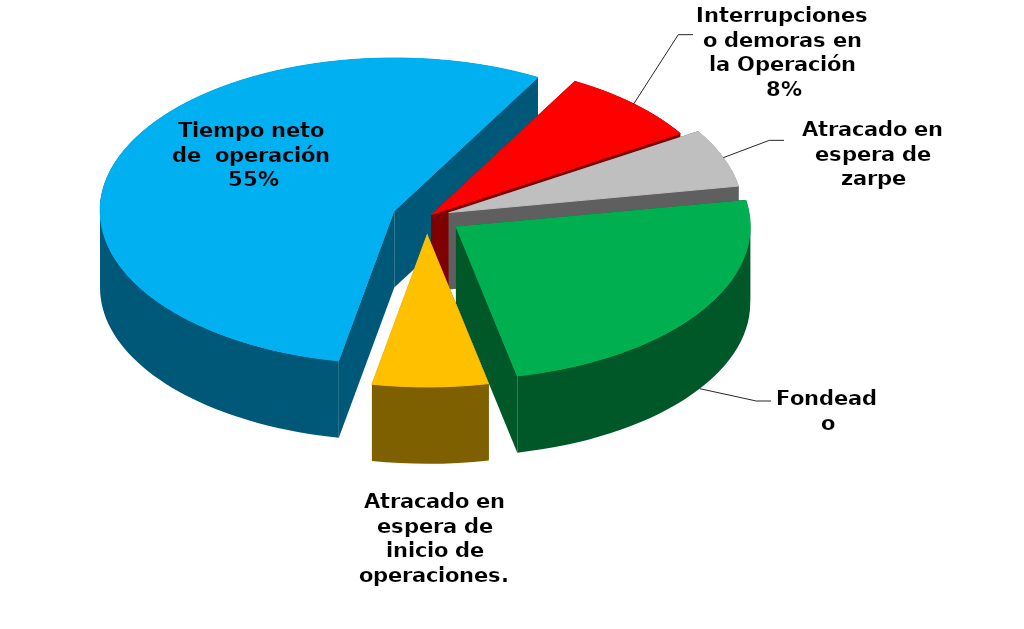
| Category | Series 0 |
|---|---|
| Fondeado | 9995.848 |
| Atracado en espera de inicio de operaciones. | 2601.534 |
| Tiempo neto de  operación | 22539.33 |
| Interrupciones o demoras en la Operación | 3255.84 |
| Atracado en espera de zarpe | 2515.393 |